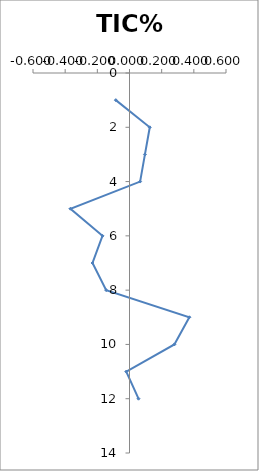
| Category | TIC% |
|---|---|
| -0.08500000000000085 | 1 |
| 0.12600000000000477 | 2 |
| 0.09600000000000364 | 3 |
| 0.06600000000000028 | 4 |
| -0.36699999999999733 | 5 |
| -0.16799999999999926 | 6 |
| -0.22999999999999687 | 7 |
| -0.14500000000000002 | 8 |
| 0.3719999999999999 | 9 |
| 0.27899999999999636 | 10 |
| -0.019999999999999574 | 11 |
| 0.05600000000000005 | 12 |